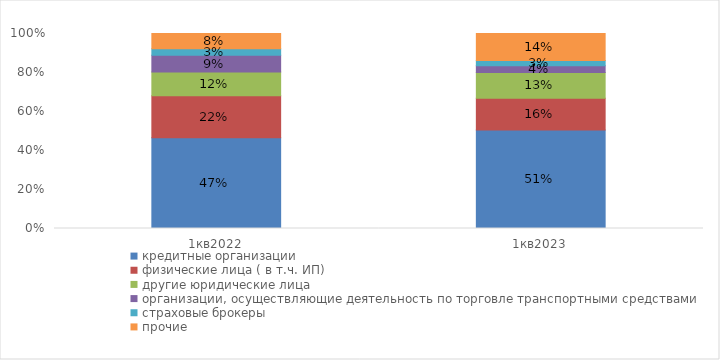
| Category | кредитные организации | физические лица ( в т.ч. ИП) | другие юридические лица | организации, осуществляющие деятельность по торговле транспортными средствами | страховые брокеры  | прочие  |
|---|---|---|---|---|---|---|
| 1кв2022 | 0.465 | 0.216 | 0.122 | 0.086 | 0.033 | 0.078 |
| 1кв2023 | 0.506 | 0.162 | 0.132 | 0.035 | 0.027 | 0.138 |